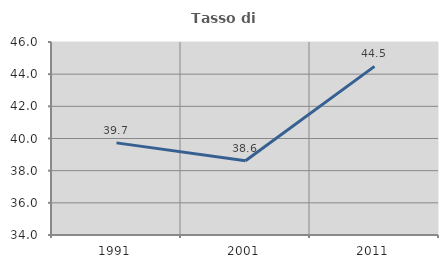
| Category | Tasso di occupazione   |
|---|---|
| 1991.0 | 39.727 |
| 2001.0 | 38.618 |
| 2011.0 | 44.484 |